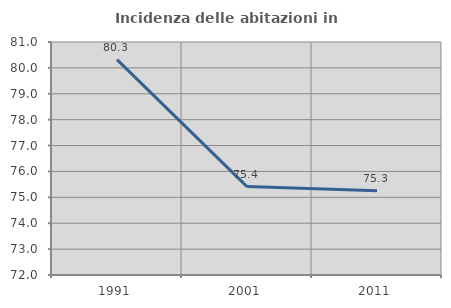
| Category | Incidenza delle abitazioni in proprietà  |
|---|---|
| 1991.0 | 80.317 |
| 2001.0 | 75.414 |
| 2011.0 | 75.254 |